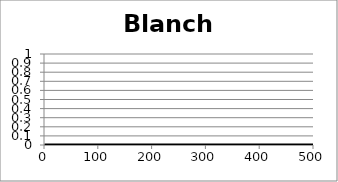
| Category | Blanche Cum |
|---|---|
| 0 | 0 |
| 1 | 0 |
| 2 | 0 |
| 3 | 0 |
| 4 | 0 |
| 5 | 0 |
| 6 | 0 |
| 7 | 0 |
| 8 | 0 |
| 9 | 0 |
| 10 | 0 |
| 11 | 0 |
| 12 | 0 |
| 13 | 0 |
| 14 | 0 |
| 15 | 0 |
| 16 | 0 |
| 17 | 0 |
| 18 | 0 |
| 19 | 0 |
| 20 | 0 |
| 21 | 0 |
| 22 | 0 |
| 23 | 0 |
| 24 | 0 |
| 25 | 0 |
| 26 | 0 |
| 27 | 0 |
| 28 | 0 |
| 29 | 0 |
| 30 | 0 |
| 31 | 0 |
| 32 | 0 |
| 33 | 0 |
| 34 | 0 |
| 35 | 0 |
| 36 | 0 |
| 37 | 0 |
| 38 | 0 |
| 39 | 0 |
| 40 | 0 |
| 41 | 0 |
| 42 | 0 |
| 43 | 0 |
| 44 | 0 |
| 45 | 0 |
| 46 | 0 |
| 47 | 0 |
| 48 | 0 |
| 49 | 0 |
| 50 | 0 |
| 51 | 0 |
| 52 | 0 |
| 53 | 0 |
| 54 | 0 |
| 55 | 0 |
| 56 | 0 |
| 57 | 0 |
| 58 | 0 |
| 59 | 0 |
| 60 | 0 |
| 61 | 0 |
| 62 | 0 |
| 63 | 0 |
| 64 | 0 |
| 65 | 0 |
| 66 | 0 |
| 67 | 0 |
| 68 | 0 |
| 69 | 0 |
| 70 | 0 |
| 71 | 0 |
| 72 | 0 |
| 73 | 0 |
| 74 | 0 |
| 75 | 0 |
| 76 | 0 |
| 77 | 0 |
| 78 | 0 |
| 79 | 0 |
| 80 | 0 |
| 81 | 0 |
| 82 | 0 |
| 83 | 0 |
| 84 | 0 |
| 85 | 0 |
| 86 | 0 |
| 87 | 0 |
| 88 | 0 |
| 89 | 0 |
| 90 | 0 |
| 91 | 0 |
| 92 | 0 |
| 93 | 0 |
| 94 | 0 |
| 95 | 0 |
| 96 | 0 |
| 97 | 0 |
| 98 | 0 |
| 99 | 0 |
| 100 | 0 |
| 101 | 0 |
| 102 | 0 |
| 103 | 0 |
| 104 | 0 |
| 105 | 0 |
| 106 | 0 |
| 107 | 0 |
| 108 | 0 |
| 109 | 0 |
| 110 | 0 |
| 111 | 0 |
| 112 | 0 |
| 113 | 0 |
| 114 | 0 |
| 115 | 0 |
| 116 | 0 |
| 117 | 0 |
| 118 | 0 |
| 119 | 0 |
| 120 | 0 |
| 121 | 0 |
| 122 | 0 |
| 123 | 0 |
| 124 | 0 |
| 125 | 0 |
| 126 | 0 |
| 127 | 0 |
| 128 | 0 |
| 129 | 0 |
| 130 | 0 |
| 131 | 0 |
| 132 | 0 |
| 133 | 0 |
| 134 | 0 |
| 135 | 0 |
| 136 | 0 |
| 137 | 0 |
| 138 | 0 |
| 139 | 0 |
| 140 | 0 |
| 141 | 0 |
| 142 | 0 |
| 143 | 0 |
| 144 | 0 |
| 145 | 0 |
| 146 | 0 |
| 147 | 0 |
| 148 | 0 |
| 149 | 0 |
| 150 | 0 |
| 151 | 0 |
| 152 | 0 |
| 153 | 0 |
| 154 | 0 |
| 155 | 0 |
| 156 | 0 |
| 157 | 0 |
| 158 | 0 |
| 159 | 0 |
| 160 | 0 |
| 161 | 0 |
| 162 | 0 |
| 163 | 0 |
| 164 | 0 |
| 165 | 0 |
| 166 | 0 |
| 167 | 0 |
| 168 | 0 |
| 169 | 0 |
| 170 | 0 |
| 171 | 0 |
| 172 | 0 |
| 173 | 0 |
| 174 | 0 |
| 175 | 0 |
| 176 | 0 |
| 177 | 0 |
| 178 | 0 |
| 179 | 0 |
| 180 | 0 |
| 181 | 0 |
| 182 | 0 |
| 183 | 0 |
| 184 | 0 |
| 185 | 0 |
| 186 | 0 |
| 187 | 0 |
| 188 | 0 |
| 189 | 0 |
| 190 | 0 |
| 191 | 0 |
| 192 | 0 |
| 193 | 0 |
| 194 | 0 |
| 195 | 0 |
| 196 | 0 |
| 197 | 0 |
| 198 | 0 |
| 199 | 0 |
| 200 | 0 |
| 201 | 0 |
| 202 | 0 |
| 203 | 0 |
| 204 | 0 |
| 205 | 0 |
| 206 | 0 |
| 207 | 0 |
| 208 | 0 |
| 209 | 0 |
| 210 | 0 |
| 211 | 0 |
| 212 | 0 |
| 213 | 0 |
| 214 | 0 |
| 215 | 0 |
| 216 | 0 |
| 217 | 0 |
| 218 | 0 |
| 219 | 0 |
| 220 | 0 |
| 221 | 0 |
| 222 | 0 |
| 223 | 0 |
| 224 | 0 |
| 225 | 0 |
| 226 | 0 |
| 227 | 0 |
| 228 | 0 |
| 229 | 0 |
| 230 | 0 |
| 231 | 0 |
| 232 | 0 |
| 233 | 0 |
| 234 | 0 |
| 235 | 0 |
| 236 | 0 |
| 237 | 0 |
| 238 | 0 |
| 239 | 0 |
| 240 | 0 |
| 241 | 0 |
| 242 | 0 |
| 243 | 0 |
| 244 | 0 |
| 245 | 0 |
| 246 | 0 |
| 247 | 0 |
| 248 | 0 |
| 249 | 0 |
| 250 | 0 |
| 251 | 0 |
| 252 | 0 |
| 253 | 0 |
| 254 | 0 |
| 255 | 0 |
| 256 | 0 |
| 257 | 0 |
| 258 | 0 |
| 259 | 0 |
| 260 | 0 |
| 261 | 0 |
| 262 | 0 |
| 263 | 0 |
| 264 | 0 |
| 265 | 0 |
| 266 | 0 |
| 267 | 0 |
| 268 | 0 |
| 269 | 0 |
| 270 | 0 |
| 271 | 0 |
| 272 | 0 |
| 273 | 0 |
| 274 | 0 |
| 275 | 0 |
| 276 | 0 |
| 277 | 0 |
| 278 | 0 |
| 279 | 0 |
| 280 | 0 |
| 281 | 0 |
| 282 | 0 |
| 283 | 0 |
| 284 | 0 |
| 285 | 0 |
| 286 | 0 |
| 287 | 0 |
| 288 | 0 |
| 289 | 0 |
| 290 | 0 |
| 291 | 0 |
| 292 | 0 |
| 293 | 0 |
| 294 | 0 |
| 295 | 0 |
| 296 | 0 |
| 297 | 0 |
| 298 | 0 |
| 299 | 0 |
| 300 | 0 |
| 301 | 0 |
| 302 | 0 |
| 303 | 0 |
| 304 | 0 |
| 305 | 0 |
| 306 | 0 |
| 307 | 0 |
| 308 | 0 |
| 309 | 0 |
| 310 | 0 |
| 311 | 0 |
| 312 | 0 |
| 313 | 0 |
| 314 | 0 |
| 315 | 0 |
| 316 | 0 |
| 317 | 0 |
| 318 | 0 |
| 319 | 0 |
| 320 | 0 |
| 321 | 0 |
| 322 | 0 |
| 323 | 0 |
| 324 | 0 |
| 325 | 0 |
| 326 | 0 |
| 327 | 0 |
| 328 | 0 |
| 329 | 0 |
| 330 | 0 |
| 331 | 0 |
| 332 | 0 |
| 333 | 0 |
| 334 | 0 |
| 335 | 0 |
| 336 | 0 |
| 337 | 0 |
| 338 | 0 |
| 339 | 0 |
| 340 | 0 |
| 341 | 0 |
| 342 | 0 |
| 343 | 0 |
| 344 | 0 |
| 345 | 0 |
| 346 | 0 |
| 347 | 0 |
| 348 | 0 |
| 349 | 0 |
| 350 | 0 |
| 351 | 0 |
| 352 | 0 |
| 353 | 0 |
| 354 | 0 |
| 355 | 0 |
| 356 | 0 |
| 357 | 0 |
| 358 | 0 |
| 359 | 0 |
| 360 | 0 |
| 361 | 0 |
| 362 | 0 |
| 363 | 0 |
| 364 | 0 |
| 365 | 0 |
| 366 | 0 |
| 367 | 0 |
| 368 | 0 |
| 369 | 0 |
| 370 | 0 |
| 371 | 0 |
| 372 | 0 |
| 373 | 0 |
| 374 | 0 |
| 375 | 0 |
| 376 | 0 |
| 377 | 0 |
| 378 | 0 |
| 379 | 0 |
| 380 | 0 |
| 381 | 0 |
| 382 | 0 |
| 383 | 0 |
| 384 | 0 |
| 385 | 0 |
| 386 | 0 |
| 387 | 0 |
| 388 | 0 |
| 389 | 0 |
| 390 | 0 |
| 391 | 0 |
| 392 | 0 |
| 393 | 0 |
| 394 | 0 |
| 395 | 0 |
| 396 | 0 |
| 397 | 0 |
| 398 | 0 |
| 399 | 0 |
| 400 | 0 |
| 401 | 0 |
| 402 | 0 |
| 403 | 0 |
| 404 | 0 |
| 405 | 0 |
| 406 | 0 |
| 407 | 0 |
| 408 | 0 |
| 409 | 0 |
| 410 | 0 |
| 411 | 0 |
| 412 | 0 |
| 413 | 0 |
| 414 | 0 |
| 415 | 0 |
| 416 | 0 |
| 417 | 0 |
| 418 | 0 |
| 419 | 0 |
| 420 | 0 |
| 421 | 0 |
| 422 | 0 |
| 423 | 0 |
| 424 | 0 |
| 425 | 0 |
| 426 | 0 |
| 427 | 0 |
| 428 | 0 |
| 429 | 0 |
| 430 | 0 |
| 431 | 0 |
| 432 | 0 |
| 433 | 0 |
| 434 | 0 |
| 435 | 0 |
| 436 | 0 |
| 437 | 0 |
| 438 | 0 |
| 439 | 0 |
| 440 | 0 |
| 441 | 0 |
| 442 | 0 |
| 443 | 0 |
| 444 | 0 |
| 445 | 0 |
| 446 | 0 |
| 447 | 0 |
| 448 | 0 |
| 449 | 0 |
| 450 | 0 |
| 451 | 0 |
| 452 | 0 |
| 453 | 0 |
| 454 | 0 |
| 455 | 0 |
| 456 | 0 |
| 457 | 0 |
| 458 | 0 |
| 459 | 0 |
| 460 | 0 |
| 461 | 0 |
| 462 | 0 |
| 463 | 0 |
| 464 | 0 |
| 465 | 0 |
| 466 | 0 |
| 467 | 0 |
| 468 | 0 |
| 469 | 0 |
| 470 | 0 |
| 471 | 0 |
| 472 | 0 |
| 473 | 0 |
| 474 | 0 |
| 475 | 0 |
| 476 | 0 |
| 477 | 0 |
| 478 | 0 |
| 479 | 0 |
| 480 | 0 |
| 481 | 0 |
| 482 | 0 |
| 483 | 0 |
| 484 | 0 |
| 485 | 0 |
| 486 | 0 |
| 487 | 0 |
| 488 | 0 |
| 489 | 0 |
| 490 | 0 |
| 491 | 0 |
| 492 | 0 |
| 493 | 0 |
| 494 | 0 |
| 495 | 0 |
| 496 | 0 |
| 497 | 0 |
| 498 | 0 |
| 499 | 0 |